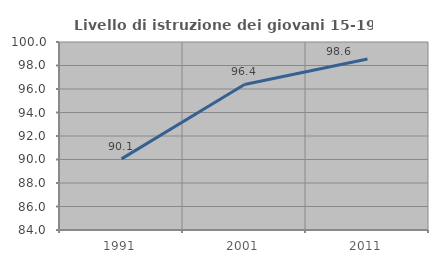
| Category | Livello di istruzione dei giovani 15-19 anni |
|---|---|
| 1991.0 | 90.052 |
| 2001.0 | 96.386 |
| 2011.0 | 98.561 |